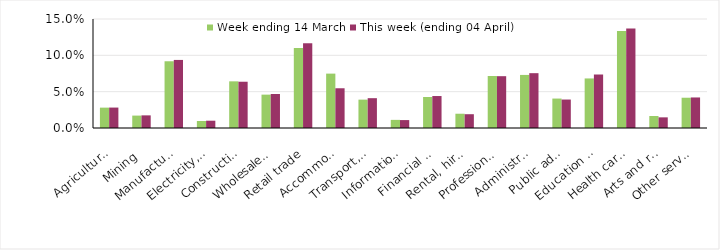
| Category | Week ending 14 March | This week (ending 04 April) |
|---|---|---|
| Agriculture, forestry and fishing | 0.028 | 0.028 |
| Mining | 0.017 | 0.017 |
| Manufacturing | 0.092 | 0.094 |
| Electricity, gas, water and waste services | 0.01 | 0.01 |
| Construction | 0.064 | 0.064 |
| Wholesale trade | 0.046 | 0.047 |
| Retail trade | 0.11 | 0.117 |
| Accommodation and food services | 0.075 | 0.055 |
| Transport, postal and warehousing | 0.039 | 0.041 |
| Information media and telecommunications | 0.011 | 0.011 |
| Financial and insurance services | 0.043 | 0.044 |
| Rental, hiring and real estate services | 0.02 | 0.019 |
| Professional, scientific and technical services | 0.072 | 0.071 |
| Administrative and support services | 0.073 | 0.075 |
| Public administration and safety | 0.041 | 0.039 |
| Education and training | 0.068 | 0.074 |
| Health care and social assistance | 0.133 | 0.137 |
| Arts and recreation services | 0.017 | 0.015 |
| Other services | 0.042 | 0.042 |